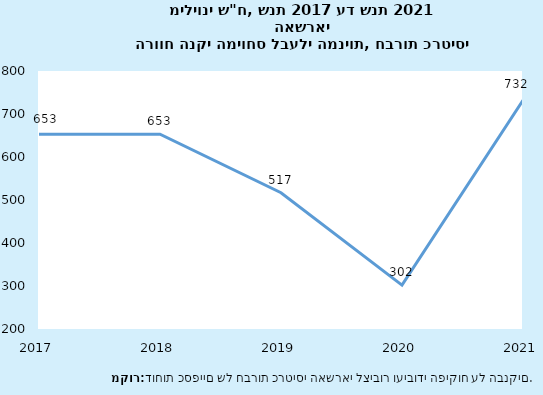
| Category | סך מערכת |
|---|---|
| 2017-12-31 | 653 |
| 2018-12-31 | 653 |
| 2019-12-31 | 517 |
| 2020-12-31 | 302 |
| 2021-12-31 | 732 |